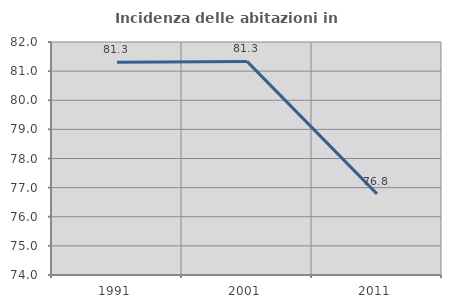
| Category | Incidenza delle abitazioni in proprietà  |
|---|---|
| 1991.0 | 81.301 |
| 2001.0 | 81.333 |
| 2011.0 | 76.786 |